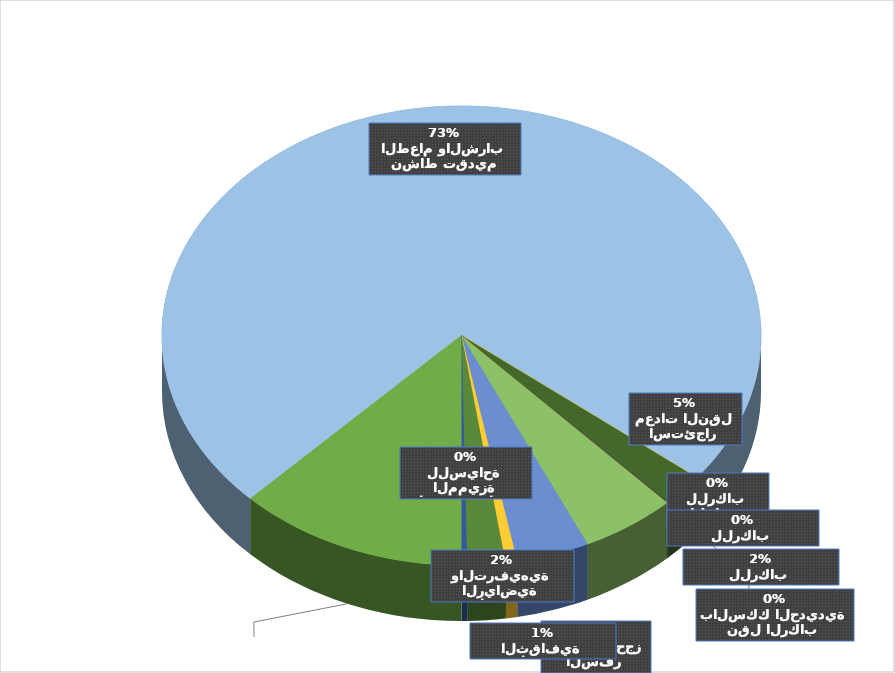
| Category | الجملة |
|---|---|
| 0 | 8726 |
| 1 | 51389 |
| 2 | 6 |
| 3 | 1583 |
| 4 | 41 |
| 5 | 30 |
| 6 | 3596 |
| 7 | 2758 |
| 8 | 438 |
| 9 | 1439 |
| 10 | 215 |